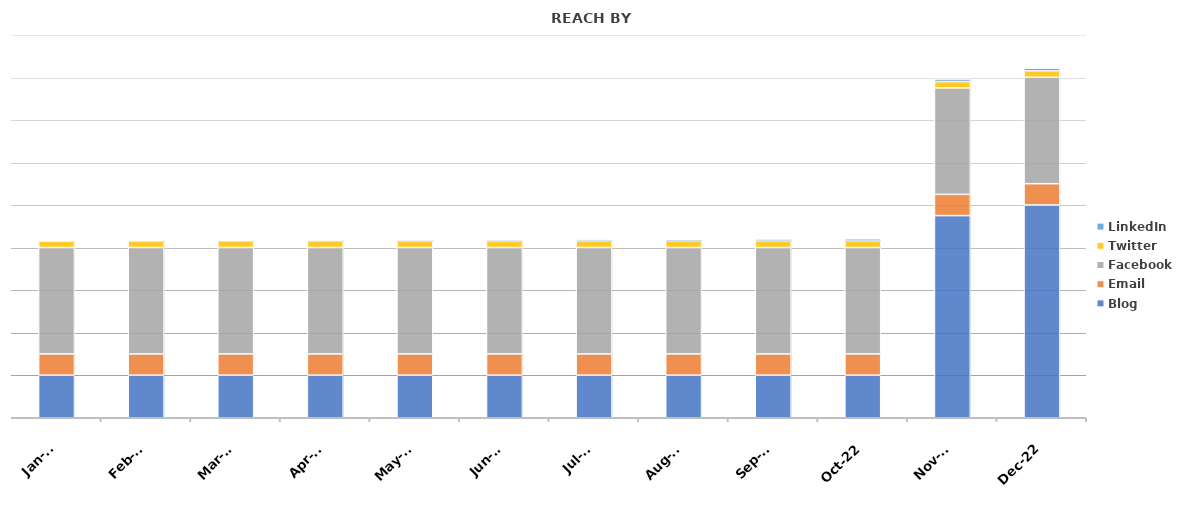
| Category | Blog | Email | Facebook | Twitter | LinkedIn |
|---|---|---|---|---|---|
| 2022-01-18 | 200 | 100 | 500 | 30 | 2 |
| 2022-02-18 | 200 | 100 | 500 | 30 | 3 |
| 2022-03-18 | 200 | 100 | 500 | 30 | 4 |
| 2022-04-18 | 200 | 100 | 500 | 30 | 5 |
| 2022-05-18 | 200 | 100 | 500 | 30 | 6 |
| 2022-06-18 | 200 | 100 | 500 | 30 | 7 |
| 2022-07-18 | 200 | 100 | 500 | 30 | 8 |
| 2022-08-18 | 200 | 100 | 500 | 30 | 9 |
| 2022-09-18 | 200 | 100 | 500 | 30 | 10 |
| 2022-10-18 | 200 | 100 | 500 | 30 | 11 |
| 2022-11-18 | 950 | 100 | 500 | 30 | 12 |
| 2022-12-18 | 1000 | 100 | 500 | 30 | 13 |